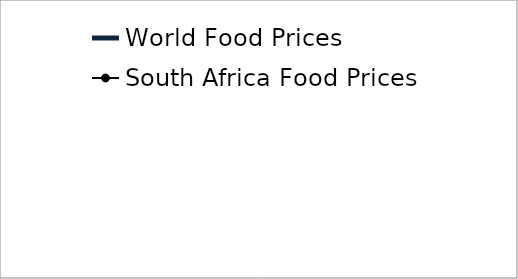
| Category | World Food Prices  | South Africa Food Prices |
|---|---|---|
| 2008.0 | 100 | 100 |
| 2009.0 | 119.596 | 102.73 |
| 2010.0 | 148.899 | 104.218 |
| 2011.0 | 141.031 | 116.253 |
| 2012.0 | 141.374 | 124.069 |
| 2013.0 | 136.321 | 128.784 |
| 2014.0 | 122.877 | 138.213 |
| 2015.0 | 101.416 | 147.022 |